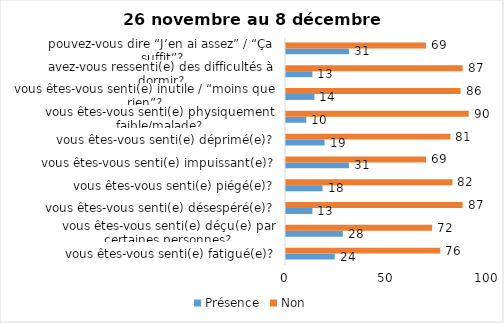
| Category | Présence | Non |
|---|---|---|
| vous êtes-vous senti(e) fatigué(e)? | 24 | 76 |
| vous êtes-vous senti(e) déçu(e) par certaines personnes? | 28 | 72 |
| vous êtes-vous senti(e) désespéré(e)? | 13 | 87 |
| vous êtes-vous senti(e) piégé(e)? | 18 | 82 |
| vous êtes-vous senti(e) impuissant(e)? | 31 | 69 |
| vous êtes-vous senti(e) déprimé(e)? | 19 | 81 |
| vous êtes-vous senti(e) physiquement faible/malade? | 10 | 90 |
| vous êtes-vous senti(e) inutile / “moins que rien”? | 14 | 86 |
| avez-vous ressenti(e) des difficultés à dormir? | 13 | 87 |
| pouvez-vous dire “J’en ai assez” / “Ça suffit”? | 31 | 69 |